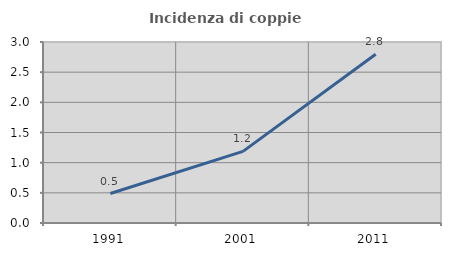
| Category | Incidenza di coppie miste |
|---|---|
| 1991.0 | 0.489 |
| 2001.0 | 1.187 |
| 2011.0 | 2.797 |